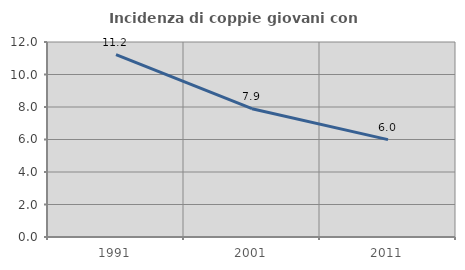
| Category | Incidenza di coppie giovani con figli |
|---|---|
| 1991.0 | 11.225 |
| 2001.0 | 7.897 |
| 2011.0 | 5.992 |